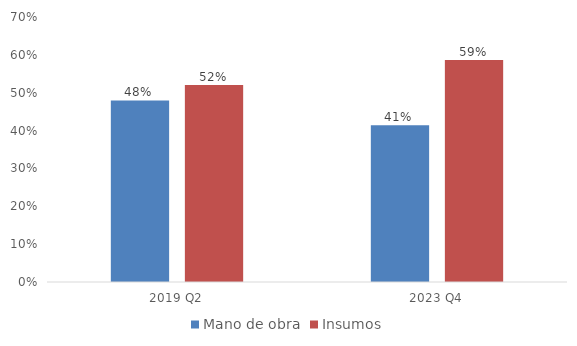
| Category | Mano de obra | Insumos |
|---|---|---|
| 2019 Q2 | 0.479 | 0.521 |
| 2023 Q4 | 0.414 | 0.586 |